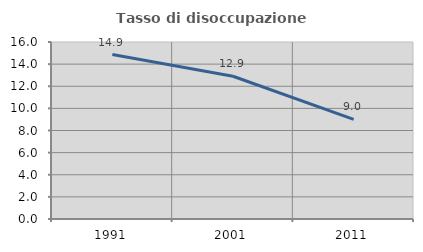
| Category | Tasso di disoccupazione giovanile  |
|---|---|
| 1991.0 | 14.865 |
| 2001.0 | 12.903 |
| 2011.0 | 9.013 |